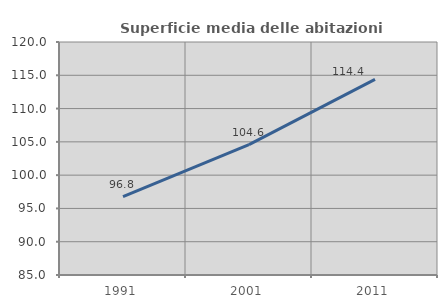
| Category | Superficie media delle abitazioni occupate |
|---|---|
| 1991.0 | 96.788 |
| 2001.0 | 104.583 |
| 2011.0 | 114.387 |